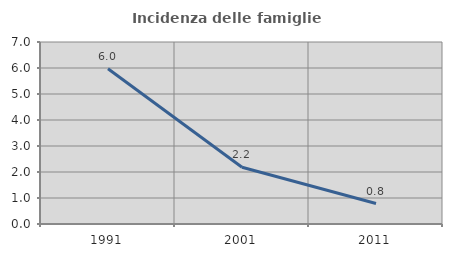
| Category | Incidenza delle famiglie numerose |
|---|---|
| 1991.0 | 5.973 |
| 2001.0 | 2.182 |
| 2011.0 | 0.786 |